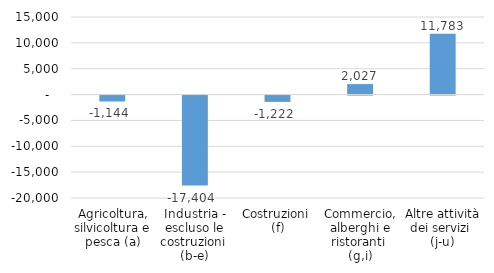
| Category | Series 0 |
|---|---|
| Agricoltura, silvicoltura e pesca (a) | -1144 |
| Industria - escluso le costruzioni 
(b-e) | -17404 |
| Costruzioni 
(f) | -1222 |
| Commercio, alberghi e ristoranti 
(g,i) | 2027 |
| Altre attività dei servizi 
(j-u) | 11783 |